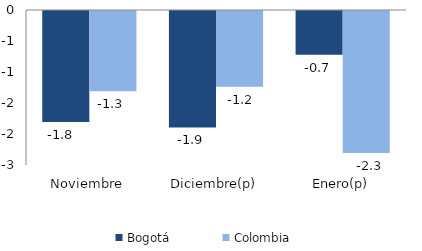
| Category | Bogotá | Colombia |
|---|---|---|
| Noviembre | -1.792 | -1.295 |
| Diciembre(p) | -1.879 | -1.222 |
| Enero(p) | -0.707 | -2.289 |